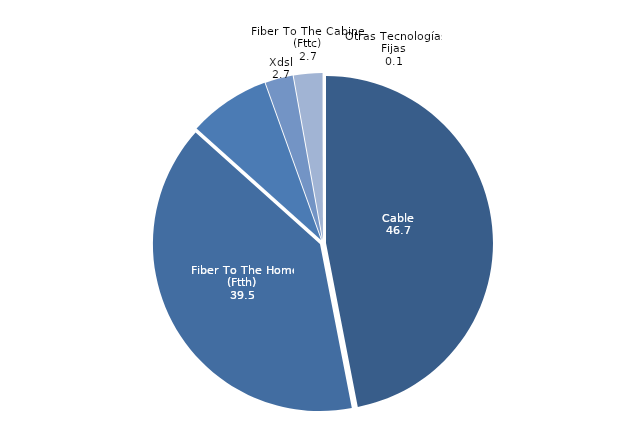
| Category | Series 0 |
|---|---|
| Cable | 46.712 |
| Fiber To The Home (Ftth) | 39.47 |
| Hybrid Fiber Coaxial (Hfc) | 7.852 |
| Xdsl | 2.658 |
| Fiber To The Cabinet (Fttc) | 2.734 |
| Otras Tecnologías Fijas | 0.065 |